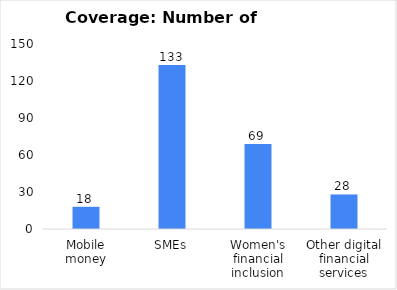
| Category | Coverage: Number of jurisdictions |
|---|---|
| Mobile money | 18 |
| SMEs | 133 |
| Women's financial inclusion | 69 |
| Other digital financial services | 28 |